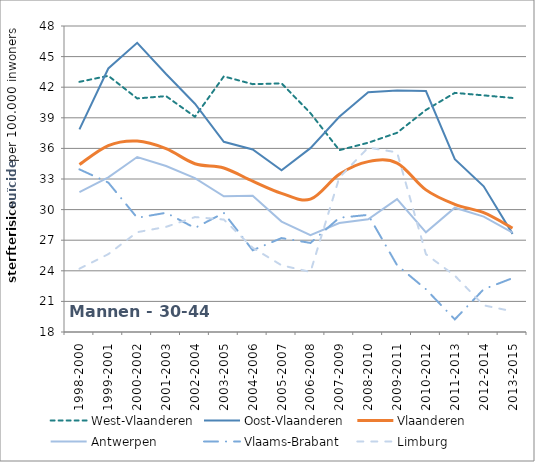
| Category | West-Vlaanderen | Oost-Vlaanderen | Vlaanderen | Antwerpen | Vlaams-Brabant | Limburg |
|---|---|---|---|---|---|---|
| 1998-2000 | 42.527 | 37.863 | 34.42 | 31.723 | 33.945 | 24.206 |
| 1999-2001 | 43.117 | 43.838 | 36.282 | 33.166 | 32.648 | 25.633 |
| 2000-2002 | 40.898 | 46.35 | 36.72 | 35.156 | 29.199 | 27.785 |
| 2001-2003 | 41.124 | 43.294 | 35.979 | 34.274 | 29.687 | 28.307 |
| 2002-2004 | 39.104 | 40.377 | 34.499 | 33.087 | 28.198 | 29.267 |
| 2003-2005 | 43.059 | 36.652 | 34.082 | 31.309 | 29.678 | 29.023 |
| 2004-2006 | 42.3 | 35.896 | 32.783 | 31.352 | 26.016 | 26.258 |
| 2005-2007 | 42.375 | 33.863 | 31.595 | 28.828 | 27.211 | 24.538 |
| 2006-2008 | 39.46 | 36.025 | 31.022 | 27.484 | 26.731 | 23.887 |
| 2007-2009 | 35.828 | 39.106 | 33.468 | 28.686 | 29.201 | 33.138 |
| 2008-2010 | 36.556 | 41.51 | 34.706 | 29.043 | 29.484 | 36.077 |
| 2009-2011 | 37.531 | 41.675 | 34.565 | 31.025 | 24.549 | 35.614 |
| 2010-2012 | 39.768 | 41.628 | 31.933 | 27.77 | 22.191 | 25.63 |
| 2011-2013 | 41.445 | 34.951 | 30.517 | 30.188 | 19.236 | 23.525 |
| 2012-2014 | 41.2 | 32.279 | 29.693 | 29.31 | 22.191 | 20.614 |
| 2013-2015 | 40.947 | 27.619 | 28.19 | 27.731 | 23.281 | 20.025 |